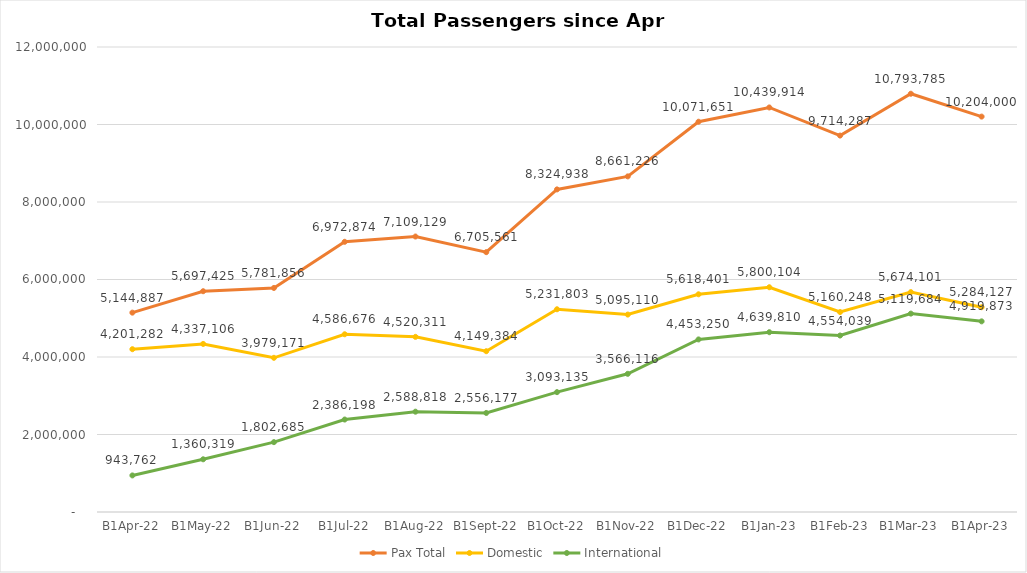
| Category | Pax Total |  Domestic  |  International  |
|---|---|---|---|
| 2022-04-01 | 5144887 | 4201282 | 943762 |
| 2022-05-01 | 5697425 | 4337106 | 1360319 |
| 2022-06-01 | 5781856 | 3979171 | 1802685 |
| 2022-07-01 | 6972874 | 4586676 | 2386198 |
| 2022-08-01 | 7109129 | 4520311 | 2588818 |
| 2022-09-01 | 6705561 | 4149384 | 2556177 |
| 2022-10-01 | 8324938 | 5231803 | 3093135 |
| 2022-11-01 | 8661226 | 5095110 | 3566116 |
| 2022-12-01 | 10071651 | 5618401 | 4453250 |
| 2023-01-01 | 10439914 | 5800104 | 4639810 |
| 2023-02-01 | 9714287 | 5160248 | 4554039 |
| 2023-03-01 | 10793785 | 5674101 | 5119684 |
| 2023-04-01 | 10204000 | 5284127 | 4919873 |